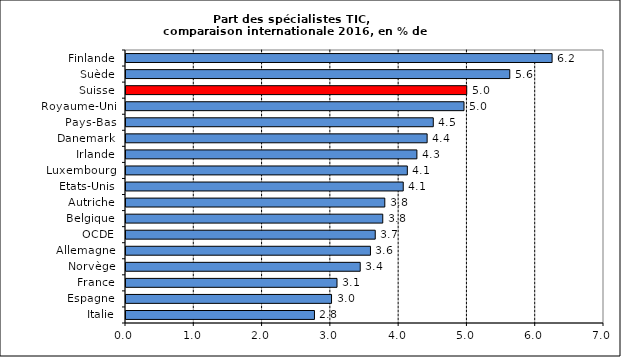
| Category | Spécialistes TIC |
|---|---|
| Italie | 2.76 |
| Espagne | 3.01 |
| France | 3.09 |
| Norvège | 3.43 |
| Allemagne | 3.58 |
| OCDE | 3.65 |
| Belgique | 3.76 |
| Autriche | 3.79 |
| Etats-Unis | 4.06 |
| Luxembourg | 4.12 |
| Irlande | 4.26 |
| Danemark | 4.41 |
| Pays-Bas | 4.5 |
| Royaume-Uni | 4.95 |
| Suisse | 4.99 |
| Suède | 5.62 |
| Finlande | 6.24 |